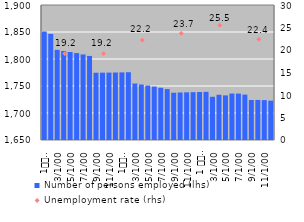
| Category | Number of persons employed (lhs) |
|---|---|
| 1
2010 | 1850.871 |
| 2 | 1846.403 |
| 3 | 1816.959 |
| 4 | 1814.822 |
| 5 | 1812.985 |
| 6 | 1810.959 |
| 7 | 1808.408 |
| 8 | 1805.651 |
| 9 | 1774.589 |
| 10 | 1774.718 |
| 11 | 1774.807 |
| 12 | 1775.021 |
| 1
2011 | 1775.193 |
| 2 | 1775.529 |
| 3 | 1754.691 |
| 4 | 1752.702 |
| 5 | 1750.891 |
| 6 | 1748.953 |
| 7 | 1746.714 |
| 8 | 1744.262 |
| 9 | 1737.585 |
| 10 | 1737.998 |
| 11 | 1738.293 |
| 12 | 1738.544 |
| 1 
2012 | 1738.87 |
| 2 | 1739.224 |
| 3 | 1730.069 |
| 4 | 1733.762 |
| 5 | 1732.614 |
| 6 | 1736.017 |
| 7 | 1735.978 |
| 8 | 1734.074 |
| 9 | 1724.027 |
| 10 | 1724.214 |
| 11 | 1723.921 |
| 12 | 1722.794 |